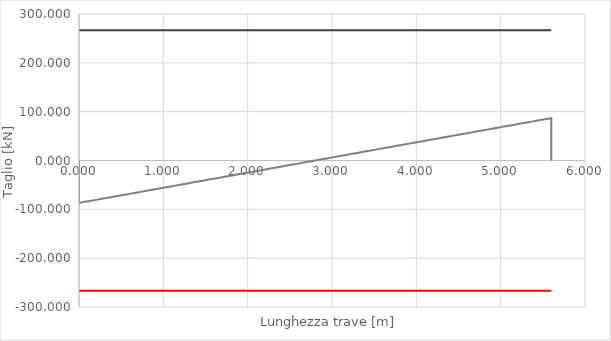
| Category | ved |
|---|---|
| 0.0 | 0 |
| 0.0 | -86.87 |
| 0.05436893203883495 | -85.183 |
| 0.1087378640776699 | -83.496 |
| 0.16310679611650486 | -81.81 |
| 0.2174757281553398 | -80.123 |
| 0.27184466019417475 | -78.436 |
| 0.3262135922330097 | -76.749 |
| 0.38058252427184464 | -75.062 |
| 0.4349514563106796 | -73.376 |
| 0.4893203883495146 | -71.689 |
| 0.5436893203883495 | -70.002 |
| 0.5980582524271845 | -68.315 |
| 0.6524271844660194 | -66.628 |
| 0.7067961165048544 | -64.942 |
| 0.7611650485436893 | -63.255 |
| 0.8155339805825242 | -61.568 |
| 0.8699029126213592 | -59.881 |
| 0.9242718446601942 | -58.194 |
| 0.9786407766990292 | -56.508 |
| 1.033009708737864 | -54.821 |
| 1.087378640776699 | -53.134 |
| 1.141747572815534 | -51.447 |
| 1.196116504854369 | -49.76 |
| 1.250485436893204 | -48.074 |
| 1.3048543689320389 | -46.387 |
| 1.3592233009708738 | -44.7 |
| 1.3592233009708738 | -44.7 |
| 1.4135922330097088 | -43.013 |
| 1.4679611650485436 | -41.327 |
| 1.5223300970873785 | -39.64 |
| 1.5766990291262135 | -37.953 |
| 1.6310679611650485 | -36.266 |
| 1.6854368932038835 | -34.579 |
| 1.7398058252427184 | -32.893 |
| 1.7941747572815534 | -31.206 |
| 1.8485436893203884 | -29.519 |
| 1.9029126213592233 | -27.832 |
| 1.9572815533980583 | -26.145 |
| 2.0116504854368933 | -24.459 |
| 2.066019417475728 | -22.772 |
| 2.1203883495145632 | -21.085 |
| 2.174757281553398 | -19.398 |
| 2.229126213592233 | -17.711 |
| 2.283495145631068 | -16.025 |
| 2.3378640776699027 | -14.338 |
| 2.392233009708738 | -12.651 |
| 2.4466019417475726 | -10.964 |
| 2.500970873786408 | -9.277 |
| 2.5553398058252426 | -7.591 |
| 2.6097087378640778 | -5.904 |
| 2.6640776699029125 | -4.217 |
| 2.7184466019417477 | -2.53 |
| 2.7728155339805824 | -0.843 |
| 2.7728155339805824 | -0.843 |
| 2.8271844660194176 | 0.843 |
| 2.8815533980582524 | 2.53 |
| 2.935922330097087 | 4.217 |
| 2.9902912621359223 | 5.904 |
| 3.044660194174757 | 7.591 |
| 3.0990291262135923 | 9.277 |
| 3.153398058252427 | 10.964 |
| 3.207766990291262 | 12.651 |
| 3.262135922330097 | 14.338 |
| 3.316504854368932 | 16.025 |
| 3.370873786407767 | 17.711 |
| 3.425242718446602 | 19.398 |
| 3.479611650485437 | 21.085 |
| 3.5339805825242716 | 22.772 |
| 3.588349514563107 | 24.459 |
| 3.6427184466019416 | 26.145 |
| 3.6970873786407767 | 27.832 |
| 3.7514563106796115 | 29.519 |
| 3.8058252427184467 | 31.206 |
| 3.8601941747572814 | 32.893 |
| 3.9145631067961166 | 34.579 |
| 3.9689320388349514 | 36.266 |
| 4.023300970873787 | 37.953 |
| 4.077669902912621 | 39.64 |
| 4.132038834951456 | 41.327 |
| 4.186407766990291 | 43.013 |
| 4.2407766990291265 | 44.7 |
| 4.295145631067961 | 46.387 |
| 4.349514563106796 | 48.074 |
| 4.403883495145631 | 49.76 |
| 4.458252427184466 | 51.447 |
| 4.512621359223301 | 53.134 |
| 4.566990291262136 | 54.821 |
| 4.621359223300971 | 56.508 |
| 4.675728155339805 | 58.194 |
| 4.730097087378641 | 59.881 |
| 4.784466019417476 | 61.568 |
| 4.8388349514563105 | 63.255 |
| 4.893203883495145 | 64.942 |
| 4.947572815533981 | 66.628 |
| 5.001941747572816 | 68.315 |
| 5.05631067961165 | 70.002 |
| 5.110679611650485 | 71.689 |
| 5.165048543689321 | 73.376 |
| 5.2194174757281555 | 75.062 |
| 5.27378640776699 | 76.749 |
| 5.328155339805825 | 78.436 |
| 5.38252427184466 | 80.123 |
| 5.436893203883495 | 81.81 |
| 5.49126213592233 | 83.496 |
| 5.545631067961165 | 85.183 |
| 5.6 | 86.87 |
| 5.6 | 0 |